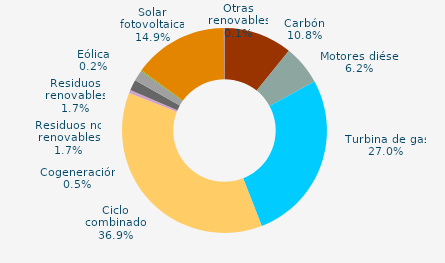
| Category | Series 0 |
|---|---|
| Carbón | 10.808 |
| Motores diésel | 6.246 |
| Turbina de gas | 27.024 |
| Ciclo combinado | 36.873 |
| Generación auxiliar | 0 |
| Cogeneración | 0.516 |
| Residuos no renovables | 1.676 |
| Residuos renovables | 1.676 |
| Eólica | 0.16 |
| Solar fotovoltaica | 14.926 |
| Otras renovables | 0.095 |